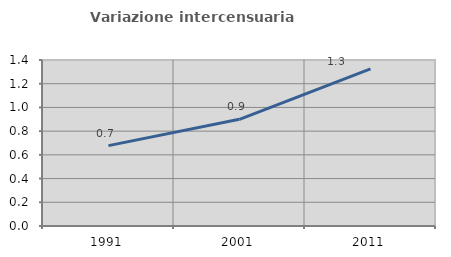
| Category | Variazione intercensuaria annua |
|---|---|
| 1991.0 | 0.678 |
| 2001.0 | 0.9 |
| 2011.0 | 1.326 |